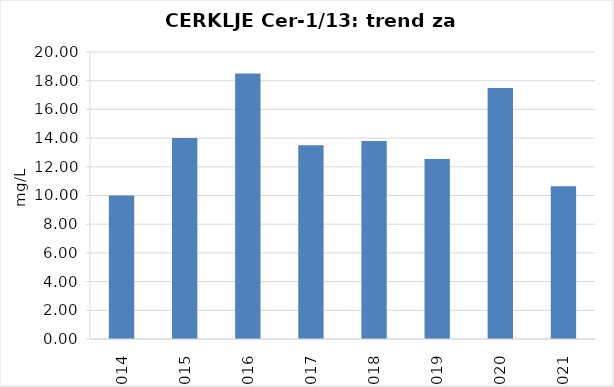
| Category | Vsota |
|---|---|
| 2014 | 10 |
| 2015 | 14 |
| 2016 | 18.5 |
| 2017 | 13.5 |
| 2018 | 13.8 |
| 2019 | 12.55 |
| 2020 | 17.5 |
| 2021 | 10.65 |